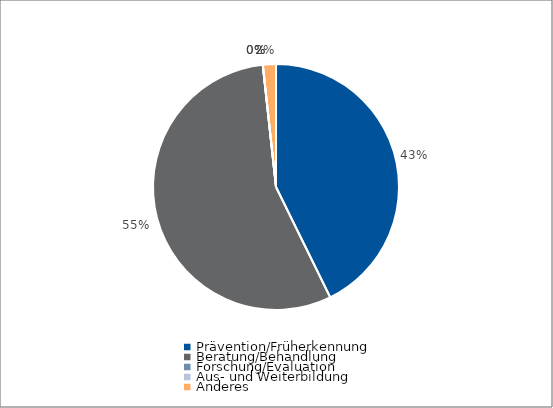
| Category | Series 0 |
|---|---|
| Prävention/Früherkennung | 317690 |
| Beratung/Behandlung | 413000 |
| Forschung/Evaluation | 0 |
| Aus- und Weiterbildung | 0 |
| Anderes | 12793 |